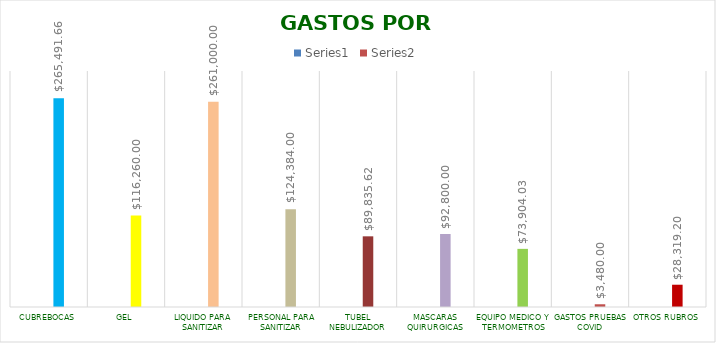
| Category | Series 0 | Series 1 |
|---|---|---|
| CUBREBOCAS |  | 265491.66 |
| GEL |  | 116260 |
| LIQUIDO PARA SANITIZAR |  | 261000 |
| PERSONAL PARA SANITIZAR |  | 124384 |
| TUBEL NEBULIZADOR |  | 89835.62 |
| MASCARAS QUIRURGICAS |  | 92800 |
| EQUIPO MEDICO Y TERMOMETROS |  | 73904.03 |
| GASTOS PRUEBAS COVID |  | 3480 |
| OTROS RUBROS |  | 28319.2 |